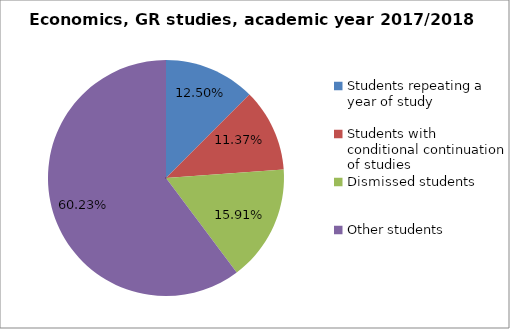
| Category | Series 0 |
|---|---|
| Students repeating a year of study | 11 |
| Students with conditional continuation of studies | 10 |
| Dismissed students | 14 |
| Other students | 53 |